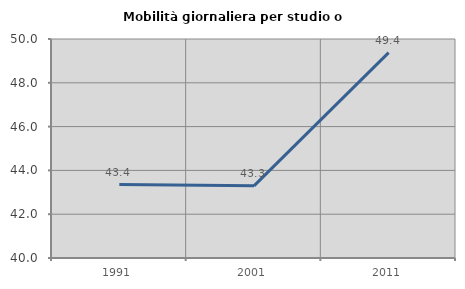
| Category | Mobilità giornaliera per studio o lavoro |
|---|---|
| 1991.0 | 43.353 |
| 2001.0 | 43.296 |
| 2011.0 | 49.375 |